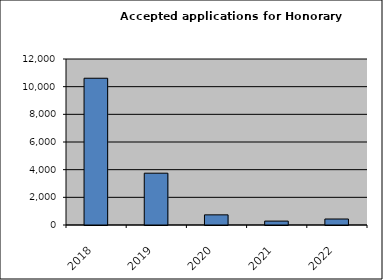
| Category | Series 0 |
|---|---|
| 2018.0 | 10609 |
| 2019.0 | 3745 |
| 2020.0 | 734 |
| 2021.0 | 282 |
| 2022.0 | 433 |